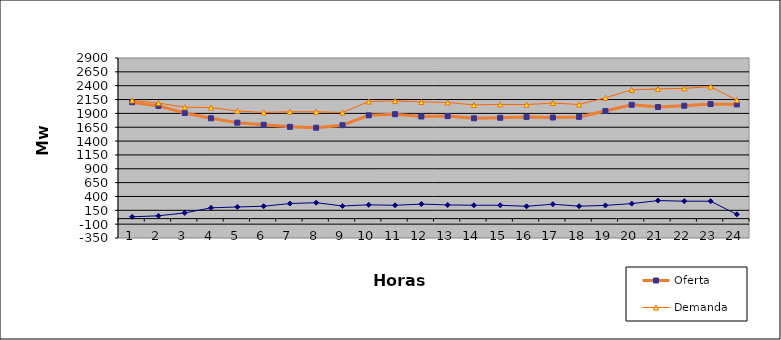
| Category | Oferta | Demanda | No Servida |
|---|---|---|---|
| 1.0 | 2101.75 | 2133.765 | 32.015 |
| 2.0 | 2034.73 | 2085.821 | 51.091 |
| 3.0 | 1907.52 | 2010.321 | 102.801 |
| 4.0 | 1811.4 | 2006.058 | 194.658 |
| 5.0 | 1732.48 | 1943.115 | 210.635 |
| 6.0 | 1694.54 | 1917.574 | 223.034 |
| 7.0 | 1656.57 | 1929.195 | 272.625 |
| 8.0 | 1641.02 | 1928.681 | 287.661 |
| 9.0 | 1687.33 | 1915.795 | 228.465 |
| 10.0 | 1865.2 | 2113.99 | 248.79 |
| 11.0 | 1885.17 | 2126.19 | 241.02 |
| 12.0 | 1843.81 | 2106.015 | 262.205 |
| 13.0 | 1850.61 | 2097.778 | 247.168 |
| 14.0 | 1811.31 | 2052.67 | 241.36 |
| 15.0 | 1821.1 | 2062.39 | 241.29 |
| 16.0 | 1836.64 | 2059.312 | 222.672 |
| 17.0 | 1825.68 | 2086.093 | 260.413 |
| 18.0 | 1836.76 | 2061.2 | 224.44 |
| 19.0 | 1942.14 | 2180.672 | 238.532 |
| 20.0 | 2054.57 | 2325.391 | 270.821 |
| 21.0 | 2015.03 | 2340.887 | 325.857 |
| 22.0 | 2038.36 | 2352.781 | 314.421 |
| 23.0 | 2069.1 | 2383.01 | 313.91 |
| 24.0 | 2062.01 | 2139.26 | 77.25 |